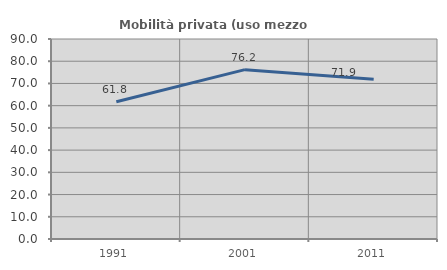
| Category | Mobilità privata (uso mezzo privato) |
|---|---|
| 1991.0 | 61.765 |
| 2001.0 | 76.214 |
| 2011.0 | 71.895 |